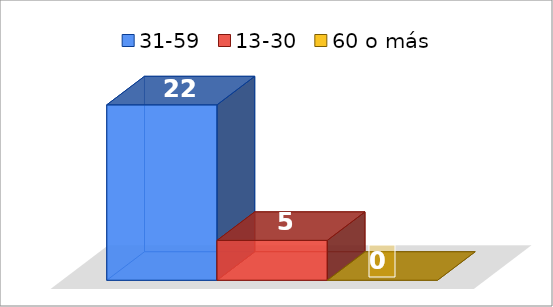
| Category | 31-59 | 13-30 | 60 o más |
|---|---|---|---|
| 0 | 22 | 5 | 0 |